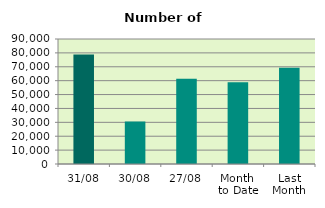
| Category | Series 0 |
|---|---|
| 31/08 | 78912 |
| 30/08 | 30588 |
| 27/08 | 61304 |
| Month 
to Date | 58874.818 |
| Last
Month | 69237.818 |